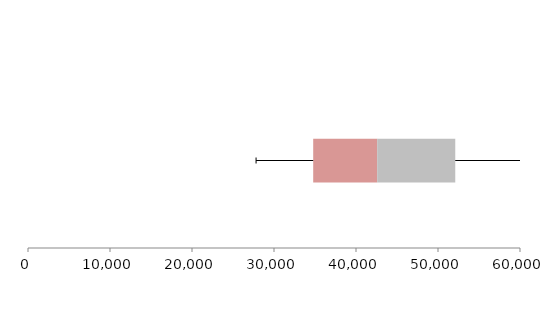
| Category | Series 1 | Series 2 | Series 3 |
|---|---|---|---|
| 0 | 34781.285 | 7801.435 | 9522.496 |